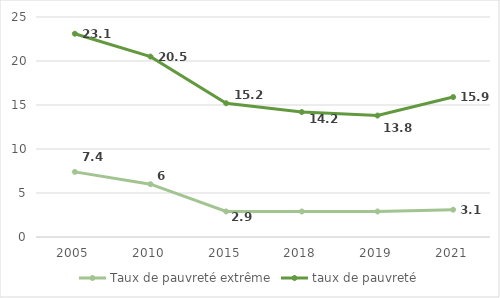
| Category | Taux de pauvreté extrême | taux de pauvreté |
|---|---|---|
| 2005.0 | 7.4 | 23.1 |
| 2010.0 | 6 | 20.5 |
| 2015.0 | 2.9 | 15.2 |
| 2018.0 | 2.9 | 14.2 |
| 2019.0 | 2.9 | 13.8 |
| 2021.0 | 3.1 | 15.9 |